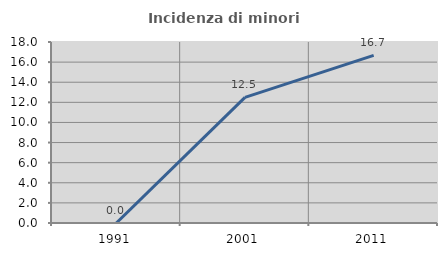
| Category | Incidenza di minori stranieri |
|---|---|
| 1991.0 | 0 |
| 2001.0 | 12.5 |
| 2011.0 | 16.667 |